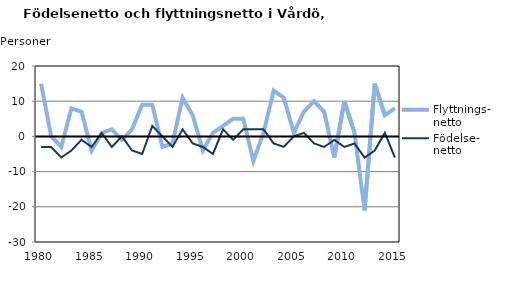
| Category | Flyttnings- netto | Födelse- netto |
|---|---|---|
| 1980.0 | 15 | -3 |
| 1981.0 | 0 | -3 |
| 1982.0 | -3 | -6 |
| 1983.0 | 8 | -4 |
| 1984.0 | 7 | -1 |
| 1985.0 | -4 | -3 |
| 1986.0 | 1 | 1 |
| 1987.0 | 2 | -3 |
| 1988.0 | -1 | 0 |
| 1989.0 | 2 | -4 |
| 1990.0 | 9 | -5 |
| 1991.0 | 9 | 3 |
| 1992.0 | -3 | 0 |
| 1993.0 | -2 | -3 |
| 1994.0 | 11 | 2 |
| 1995.0 | 6 | -2 |
| 1996.0 | -4 | -3 |
| 1997.0 | 1 | -5 |
| 1998.0 | 3 | 2 |
| 1999.0 | 5 | -1 |
| 2000.0 | 5 | 2 |
| 2001.0 | -7 | 2 |
| 2002.0 | 1 | 2 |
| 2003.0 | 13 | -2 |
| 2004.0 | 11 | -3 |
| 2005.0 | 1 | 0 |
| 2006.0 | 7 | 1 |
| 2007.0 | 10 | -2 |
| 2008.0 | 7 | -3 |
| 2009.0 | -6 | -1 |
| 2010.0 | 10 | -3 |
| 2011.0 | 1 | -2 |
| 2012.0 | -21 | -6 |
| 2013.0 | 15 | -4 |
| 2014.0 | 6 | 1 |
| 2015.0 | 8 | -6 |